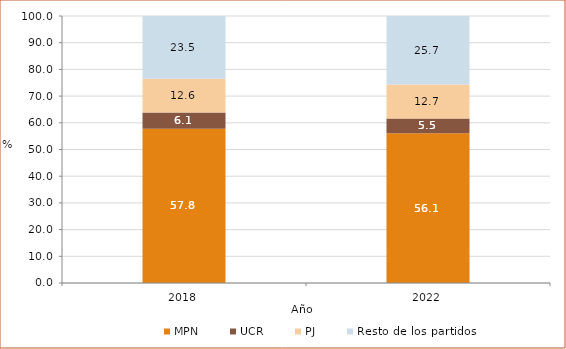
| Category | MPN | UCR | PJ | Resto de los partidos |
|---|---|---|---|---|
| 2018.0 | 57.78 | 6.122 | 12.574 | 23.524 |
| 2022.0 | 56.107 | 5.514 | 12.683 | 25.696 |